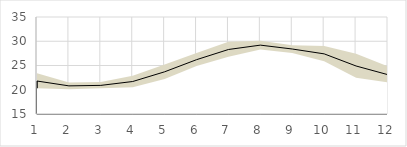
| Category | Max | Average | Min |
|---|---|---|---|
| 1.0 | 23.4 | 21.8 | 20.3 |
| 2.0 | 21.5 | 20.8 | 20.1 |
| 3.0 | 21.6 | 20.9 | 20.3 |
| 4.0 | 22.9 | 21.7 | 20.5 |
| 5.0 | 25.2 | 23.7 | 22.2 |
| 6.0 | 27.6 | 26.2 | 24.9 |
| 7.0 | 29.9 | 28.3 | 26.8 |
| 8.0 | 30.1 | 29.2 | 28.3 |
| 9.0 | 29.2 | 28.4 | 27.6 |
| 10.0 | 29 | 27.4 | 25.9 |
| 11.0 | 27.4 | 24.9 | 22.5 |
| 12.0 | 24.8 | 23.1 | 21.5 |